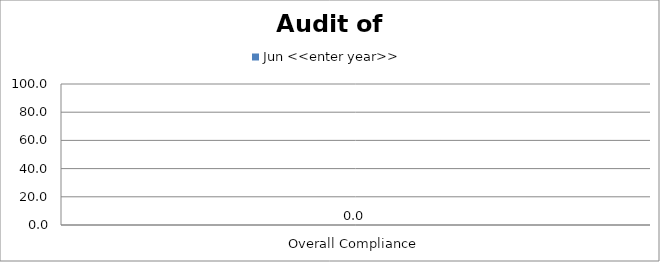
| Category | Jun <<enter year>> |
|---|---|
| Overall Compliance | 0 |